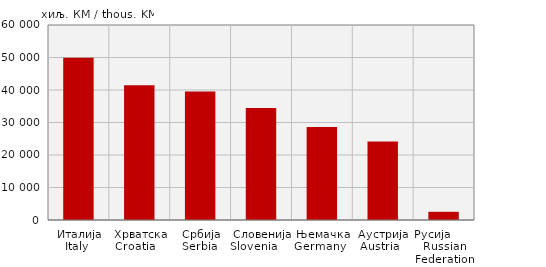
| Category | Извоз
Export |
|---|---|
| Италија
Italy  | 49933.264 |
| Хрватска
Croatia    | 41448.281 |
| Србија
Serbia  | 39525.686 |
| Словенија
Slovenia            | 34445.639 |
| Њемачка
Germany   | 28636.877 |
| Аустрија
Austria   | 24150.015 |
| Русија        Russian Federation | 2523.112 |